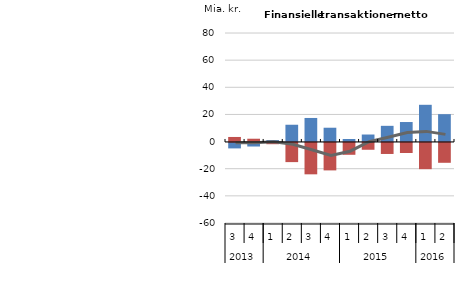
| Category | Finansielle aktiver | Gæld |
|---|---|---|
| 0 | -4.3 | 3.4 |
| 1 | -2.9 | 2.1 |
| 2 | 1.1 | -1.2 |
| 3 | 12.4 | -14.4 |
| 4 | 17.4 | -23.4 |
| 5 | 10.2 | -20.5 |
| 6 | 1.9 | -9 |
| 7 | 5.2 | -5.3 |
| 8 | 11.6 | -8.4 |
| 9 | 14.4 | -7.7 |
| 10 | 27.1 | -19.6 |
| 11 | 20.2 | -14.9 |